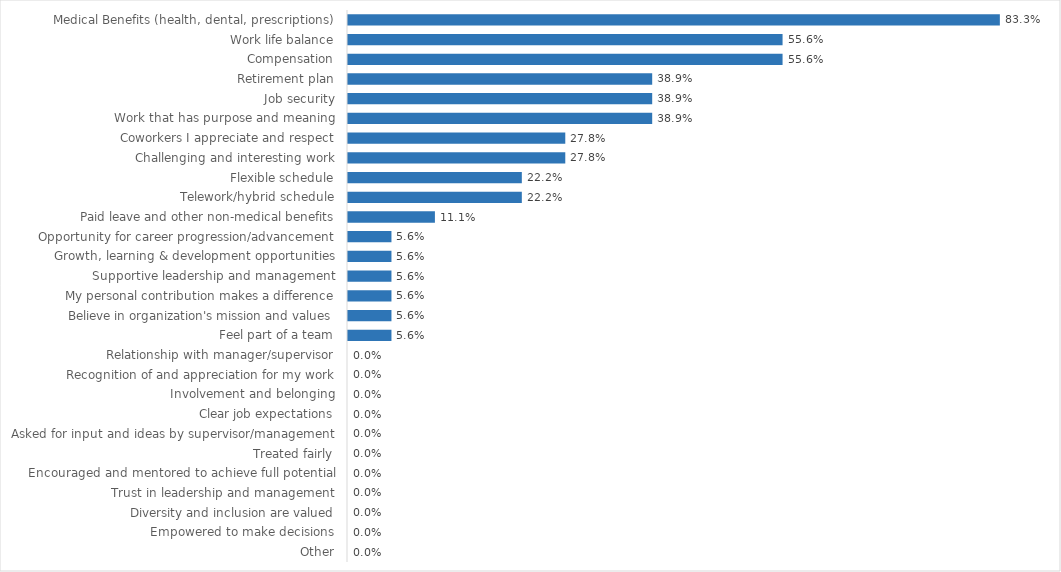
| Category | Public Utility Commission |
|---|---|
| Medical Benefits (health, dental, prescriptions) | 0.833 |
| Work life balance | 0.556 |
| Compensation | 0.556 |
| Retirement plan | 0.389 |
| Job security | 0.389 |
| Work that has purpose and meaning | 0.389 |
| Coworkers I appreciate and respect | 0.278 |
| Challenging and interesting work | 0.278 |
| Flexible schedule | 0.222 |
| Telework/hybrid schedule | 0.222 |
| Paid leave and other non-medical benefits | 0.111 |
| Opportunity for career progression/advancement | 0.056 |
| Growth, learning & development opportunities | 0.056 |
| Supportive leadership and management | 0.056 |
| My personal contribution makes a difference | 0.056 |
| Believe in organization's mission and values | 0.056 |
| Feel part of a team | 0.056 |
| Relationship with manager/supervisor | 0 |
| Recognition of and appreciation for my work | 0 |
| Involvement and belonging | 0 |
| Clear job expectations | 0 |
| Asked for input and ideas by supervisor/management | 0 |
| Treated fairly | 0 |
| Encouraged and mentored to achieve full potential | 0 |
| Trust in leadership and management | 0 |
| Diversity and inclusion are valued | 0 |
| Empowered to make decisions | 0 |
| Other | 0 |